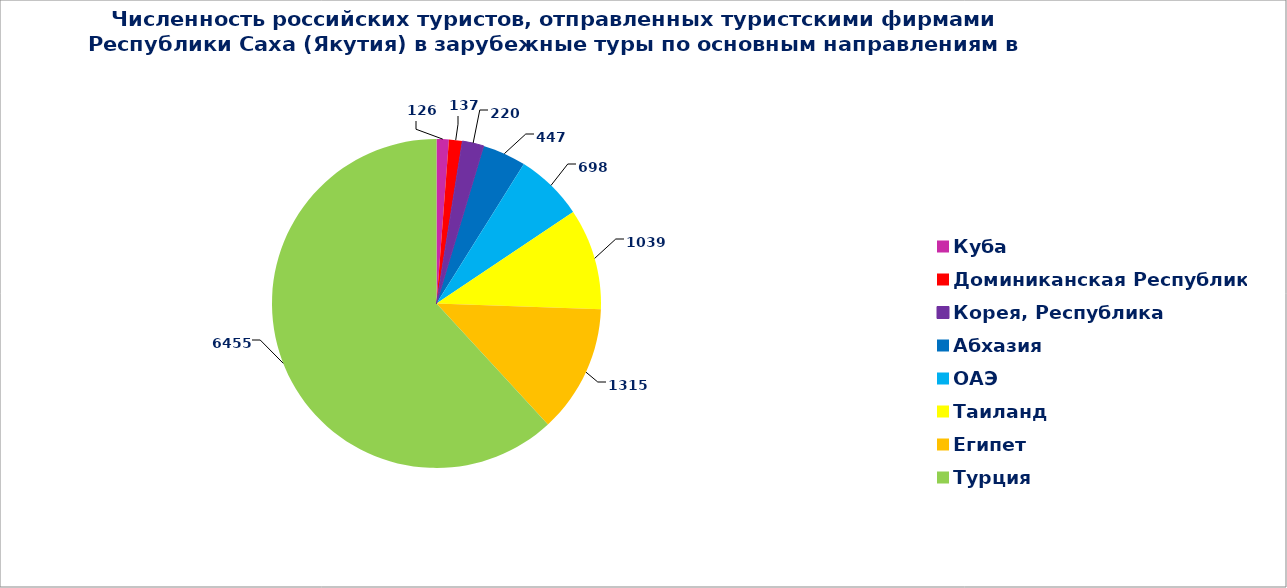
| Category | Series 0 |
|---|---|
| Куба | 126 |
| Доминиканская Республика | 137 |
| Корея, Республика | 220 |
| Абхазия | 447 |
| ОАЭ | 698 |
| Таиланд | 1039 |
| Египет | 1315 |
| Турция | 6455 |